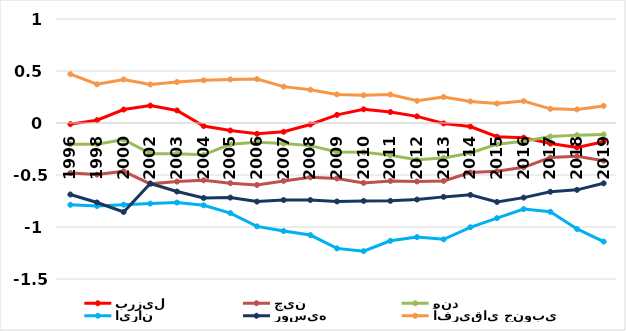
| Category | برزیل | چین | هند | ایران | روسیه | آفریقای جنوبی |
|---|---|---|---|---|---|---|
| 1996.0 | -0.011 | -0.482 | -0.204 | -0.786 | -0.687 | 0.47 |
| 1998.0 | 0.027 | -0.496 | -0.203 | -0.798 | -0.764 | 0.373 |
| 2000.0 | 0.129 | -0.464 | -0.159 | -0.786 | -0.856 | 0.419 |
| 2002.0 | 0.167 | -0.585 | -0.295 | -0.775 | -0.582 | 0.37 |
| 2003.0 | 0.121 | -0.563 | -0.296 | -0.765 | -0.659 | 0.394 |
| 2004.0 | -0.029 | -0.551 | -0.306 | -0.791 | -0.721 | 0.41 |
| 2005.0 | -0.072 | -0.578 | -0.204 | -0.866 | -0.717 | 0.419 |
| 2006.0 | -0.104 | -0.596 | -0.184 | -0.994 | -0.756 | 0.423 |
| 2007.0 | -0.084 | -0.557 | -0.198 | -1.039 | -0.741 | 0.35 |
| 2008.0 | -0.014 | -0.522 | -0.218 | -1.077 | -0.741 | 0.32 |
| 2009.0 | 0.078 | -0.534 | -0.278 | -1.206 | -0.754 | 0.275 |
| 2010.0 | 0.132 | -0.576 | -0.282 | -1.232 | -0.749 | 0.267 |
| 2011.0 | 0.106 | -0.557 | -0.309 | -1.133 | -0.749 | 0.274 |
| 2012.0 | 0.064 | -0.562 | -0.353 | -1.097 | -0.736 | 0.213 |
| 2013.0 | -0.004 | -0.557 | -0.336 | -1.119 | -0.71 | 0.25 |
| 2014.0 | -0.034 | -0.476 | -0.288 | -1.003 | -0.691 | 0.208 |
| 2015.0 | -0.132 | -0.464 | -0.204 | -0.915 | -0.759 | 0.187 |
| 2016.0 | -0.141 | -0.426 | -0.176 | -0.828 | -0.718 | 0.21 |
| 2017.0 | -0.198 | -0.332 | -0.13 | -0.854 | -0.661 | 0.136 |
| 2018.0 | -0.236 | -0.32 | -0.117 | -1.019 | -0.643 | 0.131 |
| 2019.0 | -0.18 | -0.363 | -0.11 | -1.14 | -0.58 | 0.164 |